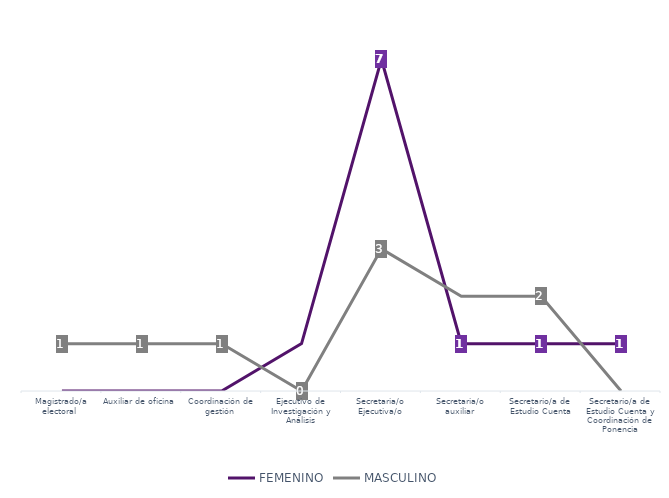
| Category | FEMENINO | MASCULINO |
|---|---|---|
| Magistrado/a electoral  | 0 | 1 |
| Auxiliar de oficina | 0 | 1 |
| Coordinación de gestión  | 0 | 1 |
| Ejecutivo de Investigación y Análisis | 1 | 0 |
| Secretaria/o Ejecutiva/o | 7 | 3 |
| Secretaria/o auxiliar | 1 | 2 |
| Secretario/a de Estudio Cuenta | 1 | 2 |
| Secretario/a de Estudio Cuenta y Coordinación de Ponencia | 1 | 0 |